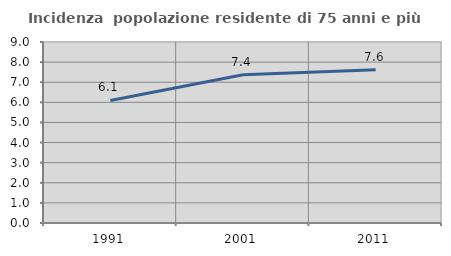
| Category | Incidenza  popolazione residente di 75 anni e più |
|---|---|
| 1991.0 | 6.095 |
| 2001.0 | 7.369 |
| 2011.0 | 7.623 |